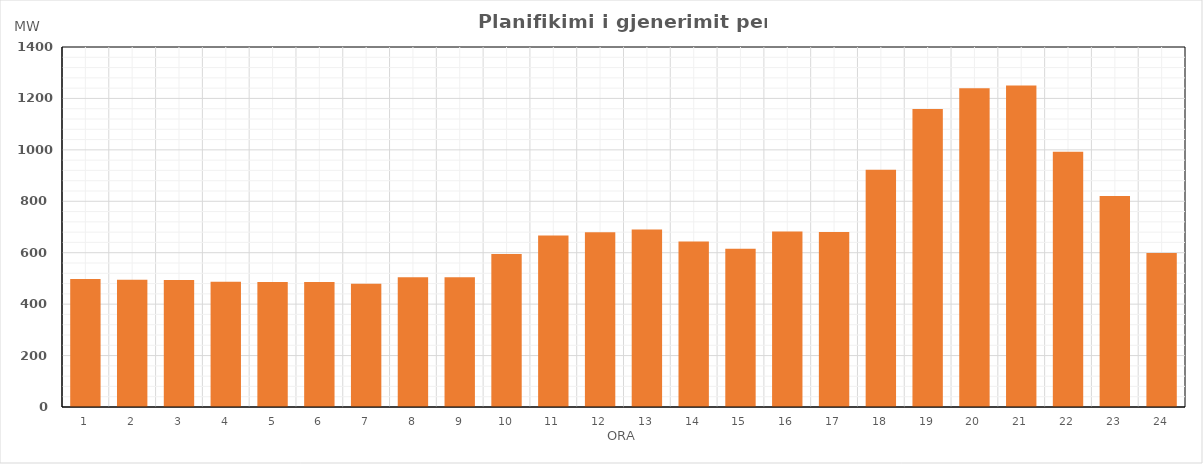
| Category | Max (MW) |
|---|---|
| 0 | 498.03 |
| 1 | 495.03 |
| 2 | 494.03 |
| 3 | 487.03 |
| 4 | 486.03 |
| 5 | 486.03 |
| 6 | 479.03 |
| 7 | 504.126 |
| 8 | 505.022 |
| 9 | 595.287 |
| 10 | 667.03 |
| 11 | 679.45 |
| 12 | 690.376 |
| 13 | 643.246 |
| 14 | 615.183 |
| 15 | 682.191 |
| 16 | 680.181 |
| 17 | 923.03 |
| 18 | 1159.03 |
| 19 | 1240.03 |
| 20 | 1250.03 |
| 21 | 993.013 |
| 22 | 820.738 |
| 23 | 599.261 |